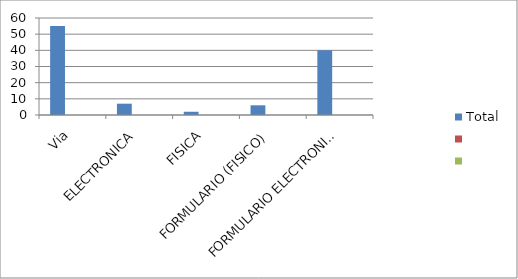
| Category | Total | Series 1 | Series 2 |
|---|---|---|---|
| Via | 55 |  |  |
| ELECTRONICA | 7 |  |  |
| FISICA | 2 |  |  |
| FORMULARIO (FISICO) | 6 |  |  |
| FORMULARIO ELECTRONICO  SAIP | 40 |  |  |